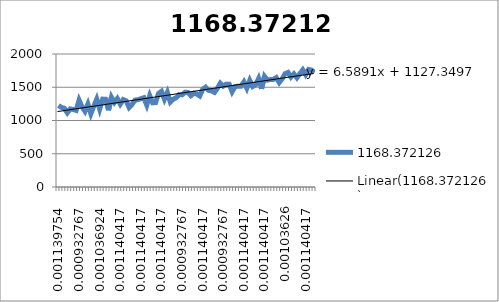
| Category | 1168.372126 |
|---|---|
| 0.00113975385827918 | 1226.32 |
| 0.00124391064276682 | 1197.201 |
| 0.0011404172772886 | 1183.206 |
| 0.00114041727728845 | 1115.636 |
| 0.00103626049280095 | 1173.748 |
| 0.0011404172772886 | 1165.59 |
| 0.0011404172772886 | 1151.54 |
| 0.000932767127322725 | 1305.808 |
| 0.00103692391181037 | 1205.829 |
| 0.00103626049280095 | 1139.003 |
| 0.0010362604928008 | 1247.03 |
| 0.00103692391181037 | 1100.998 |
| 0.0011404172772886 | 1214.957 |
| 0.00113975385827918 | 1321.817 |
| 0.00103692391181037 | 1170.927 |
| 0.00124391064276682 | 1321.676 |
| 0.00124391064276668 | 1320.485 |
| 0.0011404172772886 | 1153.703 |
| 0.00124391064276682 | 1350.144 |
| 0.00124391064276668 | 1271.157 |
| 0.00103626049280095 | 1329.449 |
| 0.0011404172772886 | 1245.573 |
| 0.0011404172772886 | 1314.882 |
| 0.000932767127322725 | 1295.95 |
| 0.00103626049280095 | 1196.222 |
| 0.00103692391181037 | 1241.71 |
| 0.00103692391181037 | 1306.6 |
| 0.0010362604928008 | 1312.633 |
| 0.0011404172772886 | 1327.052 |
| 0.00103626049280095 | 1342.285 |
| 0.0011404172772886 | 1230.449 |
| 0.0011404172772886 | 1374.797 |
| 0.00113975385827903 | 1265.696 |
| 0.0011404172772886 | 1269.402 |
| 0.0011404172772886 | 1406.383 |
| 0.0011404172772886 | 1438.848 |
| 0.00113975385827918 | 1319.505 |
| 0.00103692391181037 | 1422.494 |
| 0.00124391064276668 | 1277.418 |
| 0.0011404172772886 | 1319.725 |
| 0.000932767127322725 | 1342.763 |
| 0.0011404172772886 | 1388.839 |
| 0.000932767127322725 | 1385.595 |
| 0.0011404172772886 | 1423.952 |
| 0.0010362604928008 | 1422.291 |
| 0.0011404172772886 | 1373.895 |
| 0.0011404172772886 | 1410.92 |
| 0.00103626049280095 | 1398.007 |
| 0.0011404172772886 | 1368.771 |
| 0.0011404172772886 | 1468.75 |
| 0.00124391064276668 | 1500.784 |
| 0.00124391064276682 | 1452.592 |
| 0.00103626049280095 | 1445.47 |
| 0.00124391064276668 | 1422.549 |
| 0.0011404172772886 | 1484.148 |
| 0.00124391064276682 | 1560.886 |
| 0.000932767127322725 | 1516.974 |
| 0.00103692391181037 | 1546.868 |
| 0.000932767127322725 | 1546.844 |
| 0.0011404172772886 | 1432.791 |
| 0.000932767127322725 | 1509.474 |
| 0.00103692391181037 | 1516.613 |
| 0.00103626049280095 | 1516.237 |
| 0.00114041727728845 | 1580.986 |
| 0.00113975385827918 | 1485.002 |
| 0.00103692391181037 | 1603.64 |
| 0.00124391064276682 | 1511.245 |
| 0.0011404172772886 | 1537.809 |
| 0.00124391064276668 | 1631.246 |
| 0.00113975385827918 | 1476.994 |
| 0.0011404172772886 | 1663.954 |
| 0.0011404172772886 | 1607.738 |
| 0.00114041727728845 | 1615.974 |
| 0.00103626049280095 | 1618.011 |
| 0.0011404172772886 | 1645.265 |
| 0.00103692391181037 | 1570.721 |
| 0.000932767127322725 | 1625.651 |
| 0.00103626049280095 | 1703.714 |
| 0.0011404172772886 | 1722.92 |
| 0.0011404172772886 | 1652.49 |
| 0.0010362604928008 | 1701.206 |
| 0.0011404172772886 | 1642.89 |
| 0.0011404172772886 | 1703.737 |
| 0.00113975385827918 | 1762.186 |
| 0.00114041727728845 | 1688.864 |
| 0.0011404172772886 | 1767.742 |
| 0.0011404172772886 | 1757.845 |
| 0.00124391064276682 | 1721.831 |